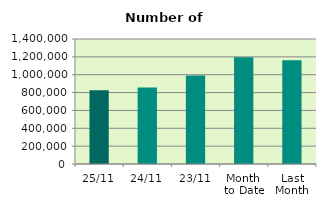
| Category | Series 0 |
|---|---|
| 25/11 | 826478 |
| 24/11 | 856824 |
| 23/11 | 992168 |
| Month 
to Date | 1194482 |
| Last
Month | 1161301.714 |